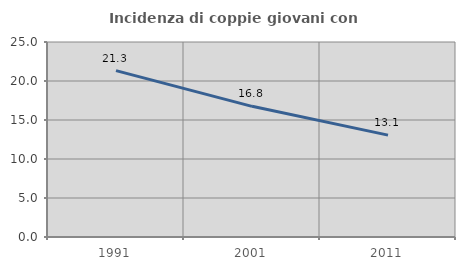
| Category | Incidenza di coppie giovani con figli |
|---|---|
| 1991.0 | 21.328 |
| 2001.0 | 16.752 |
| 2011.0 | 13.062 |